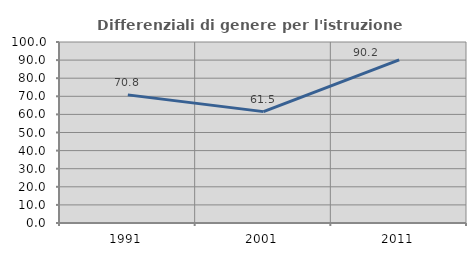
| Category | Differenziali di genere per l'istruzione superiore |
|---|---|
| 1991.0 | 70.786 |
| 2001.0 | 61.528 |
| 2011.0 | 90.157 |